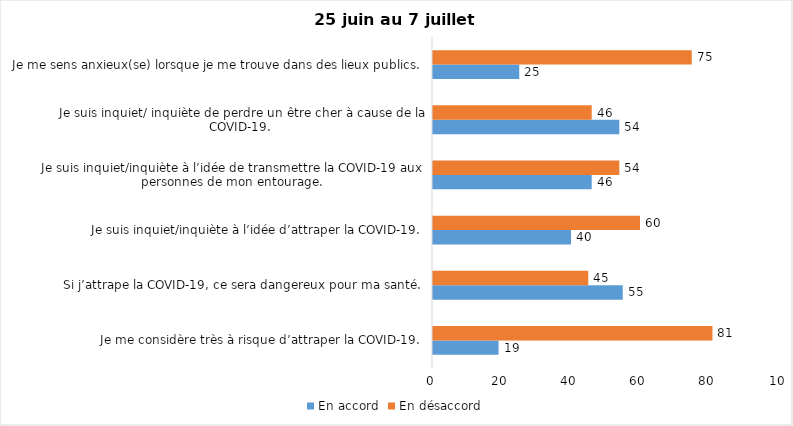
| Category | En accord | En désaccord |
|---|---|---|
| Je me considère très à risque d’attraper la COVID-19. | 19 | 81 |
| Si j’attrape la COVID-19, ce sera dangereux pour ma santé. | 55 | 45 |
| Je suis inquiet/inquiète à l’idée d’attraper la COVID-19. | 40 | 60 |
| Je suis inquiet/inquiète à l’idée de transmettre la COVID-19 aux personnes de mon entourage. | 46 | 54 |
| Je suis inquiet/ inquiète de perdre un être cher à cause de la COVID-19. | 54 | 46 |
| Je me sens anxieux(se) lorsque je me trouve dans des lieux publics. | 25 | 75 |